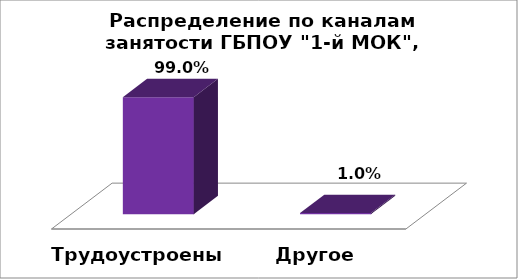
| Category | Series 0 |
|---|---|
| Трудоустроены | 0.99 |
| Другое | 0.01 |